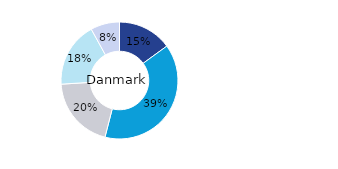
| Category | Danmark |
|---|---|
| Kontor | 0.15 |
| Bostäder | 0.39 |
| Handel | 0.2 |
| Logistik* | 0.18 |
| Övrigt | 0.08 |